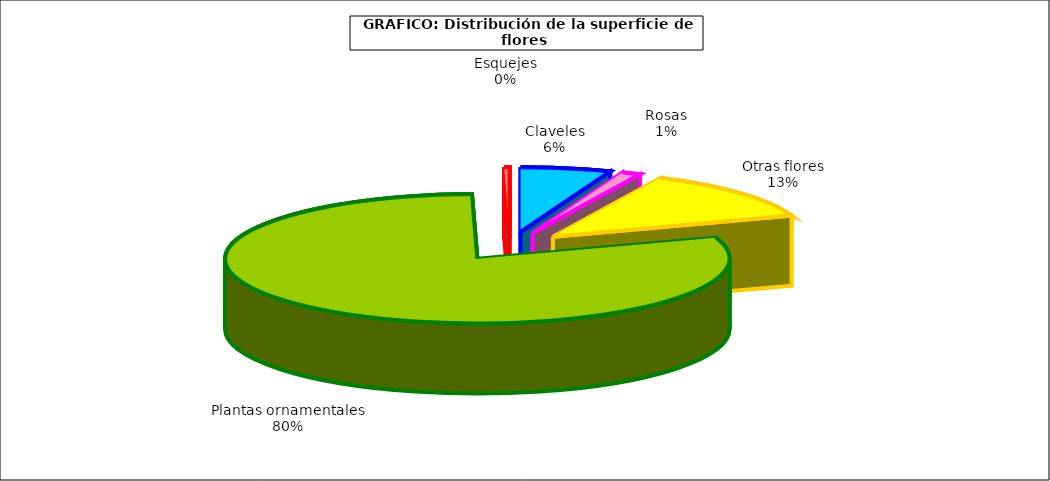
| Category | Series 0 |
|---|---|
| 0 | 35420 |
| 1 | 7406 |
| 2 | 77931 |
| 3 | 489392 |
| 4 | 2100 |